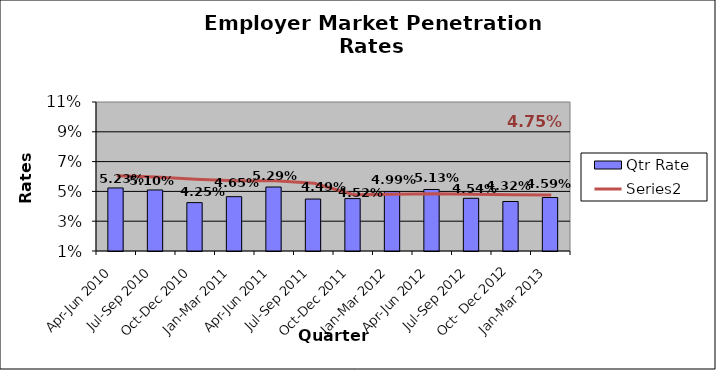
| Category | Qtr Rate |
|---|---|
| Apr-Jun 2010 | 0.052 |
| Jul-Sep 2010 | 0.051 |
| Oct-Dec 2010 | 0.042 |
| Jan-Mar 2011 | 0.046 |
| Apr-Jun 2011 | 0.053 |
| Jul-Sep 2011 | 0.045 |
| Oct-Dec 2011 | 0.045 |
| Jan-Mar 2012 | 0.05 |
| Apr-Jun 2012 | 0.051 |
| Jul-Sep 2012 | 0.045 |
| Oct- Dec 2012 | 0.043 |
| Jan-Mar 2013 | 0.046 |